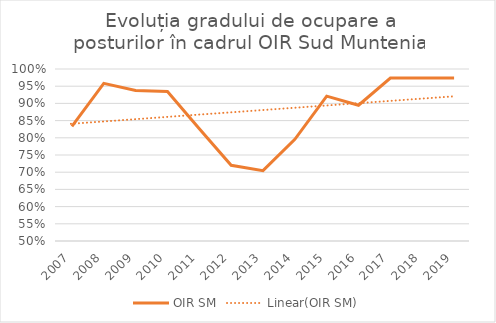
| Category | OIR SM |
|---|---|
| 2007.0 | 0.833 |
| 2008.0 | 0.958 |
| 2009.0 | 0.938 |
| 2010.0 | 0.935 |
| 2011.0 | 0.826 |
| 2012.0 | 0.72 |
| 2013.0 | 0.704 |
| 2014.0 | 0.796 |
| 2015.0 | 0.921 |
| 2016.0 | 0.895 |
| 2017.0 | 0.974 |
| 2018.0 | 0.974 |
| 2019.0 | 0.974 |